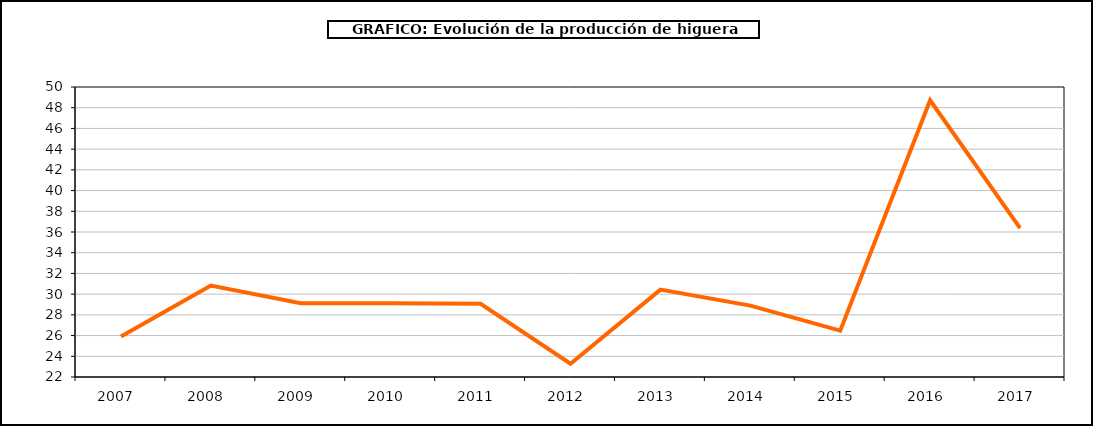
| Category | producción higuera |
|---|---|
| 2007.0 | 25.906 |
| 2008.0 | 30.828 |
| 2009.0 | 29.12 |
| 2010.0 | 29.12 |
| 2011.0 | 29.071 |
| 2012.0 | 23.285 |
| 2013.0 | 30.434 |
| 2014.0 | 28.893 |
| 2015.0 | 26.479 |
| 2016.0 | 48.718 |
| 2017.0 | 36.38 |